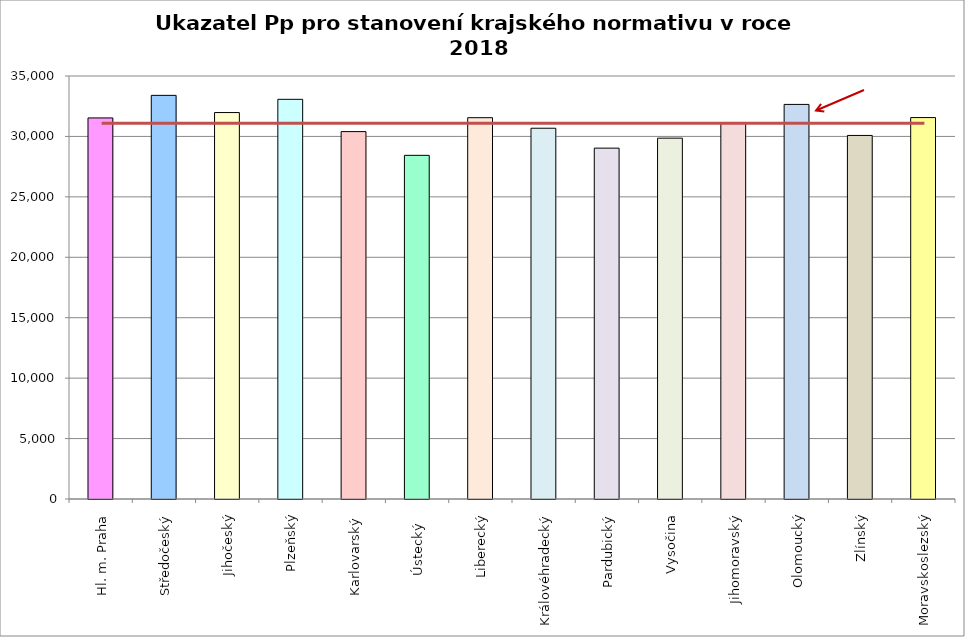
| Category | Series 0 |
|---|---|
| Hl. m. Praha | 31530 |
| Středočeský | 33398 |
| Jihočeský | 31975 |
| Plzeňský | 33070 |
| Karlovarský  | 30400 |
| Ústecký   | 28435 |
| Liberecký | 31550 |
| Královéhradecký | 30679 |
| Pardubický | 29031 |
| Vysočina | 29858 |
| Jihomoravský | 31079 |
| Olomoucký | 32649 |
| Zlínský | 30081 |
| Moravskoslezský | 31560 |